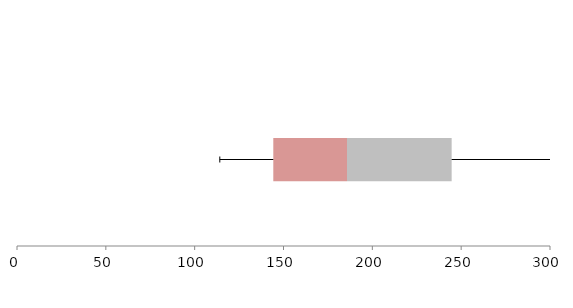
| Category | Series 1 | Series 2 | Series 3 |
|---|---|---|---|
| 0 | 144.259 | 41.481 | 58.904 |